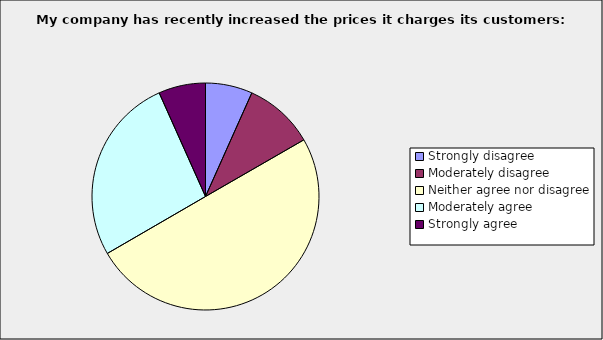
| Category | Series 0 |
|---|---|
| Strongly disagree | 0.067 |
| Moderately disagree | 0.1 |
| Neither agree nor disagree | 0.5 |
| Moderately agree | 0.267 |
| Strongly agree | 0.067 |